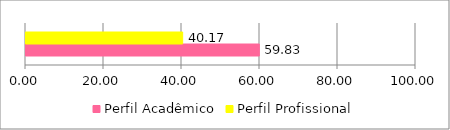
| Category | Perfil Acadêmico | Perfil Profissional |
|---|---|---|
| 0 | 59.829 | 40.171 |